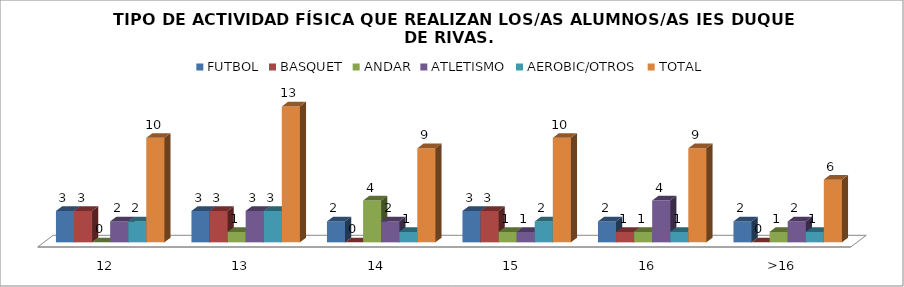
| Category | FUTBOL | BASQUET | ANDAR | ATLETISMO | AEROBIC/OTROS | TOTAL |
|---|---|---|---|---|---|---|
| 12 | 3 | 3 | 0 | 2 | 2 | 10 |
| 13 | 3 | 3 | 1 | 3 | 3 | 13 |
| 14 | 2 | 0 | 4 | 2 | 1 | 9 |
| 15 | 3 | 3 | 1 | 1 | 2 | 10 |
| 16 | 2 | 1 | 1 | 4 | 1 | 9 |
| >16 | 2 | 0 | 1 | 2 | 1 | 6 |